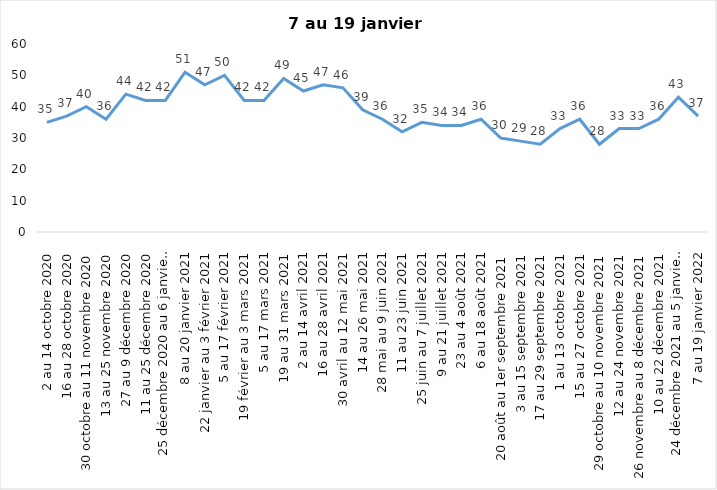
| Category | Toujours aux trois mesures |
|---|---|
| 2 au 14 octobre 2020 | 35 |
| 16 au 28 octobre 2020 | 37 |
| 30 octobre au 11 novembre 2020 | 40 |
| 13 au 25 novembre 2020 | 36 |
| 27 au 9 décembre 2020 | 44 |
| 11 au 25 décembre 2020 | 42 |
| 25 décembre 2020 au 6 janvier 2021 | 42 |
| 8 au 20 janvier 2021 | 51 |
| 22 janvier au 3 février 2021 | 47 |
| 5 au 17 février 2021 | 50 |
| 19 février au 3 mars 2021 | 42 |
| 5 au 17 mars 2021 | 42 |
| 19 au 31 mars 2021 | 49 |
| 2 au 14 avril 2021 | 45 |
| 16 au 28 avril 2021 | 47 |
| 30 avril au 12 mai 2021 | 46 |
| 14 au 26 mai 2021 | 39 |
| 28 mai au 9 juin 2021 | 36 |
| 11 au 23 juin 2021 | 32 |
| 25 juin au 7 juillet 2021 | 35 |
| 9 au 21 juillet 2021 | 34 |
| 23 au 4 août 2021 | 34 |
| 6 au 18 août 2021 | 36 |
| 20 août au 1er septembre 2021 | 30 |
| 3 au 15 septembre 2021 | 29 |
| 17 au 29 septembre 2021 | 28 |
| 1 au 13 octobre 2021 | 33 |
| 15 au 27 octobre 2021 | 36 |
| 29 octobre au 10 novembre 2021 | 28 |
| 12 au 24 novembre 2021 | 33 |
| 26 novembre au 8 décembre 2021 | 33 |
| 10 au 22 décembre 2021 | 36 |
| 24 décembre 2021 au 5 janvier 2022 2022 | 43 |
| 7 au 19 janvier 2022 | 37 |